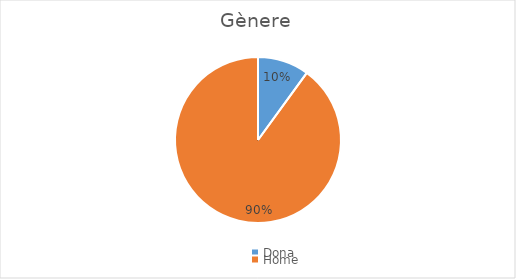
| Category | Series 0 |
|---|---|
| Dona | 5 |
| Home | 45 |